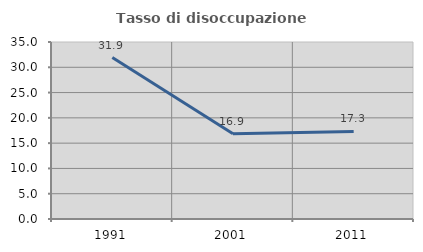
| Category | Tasso di disoccupazione giovanile  |
|---|---|
| 1991.0 | 31.915 |
| 2001.0 | 16.867 |
| 2011.0 | 17.308 |